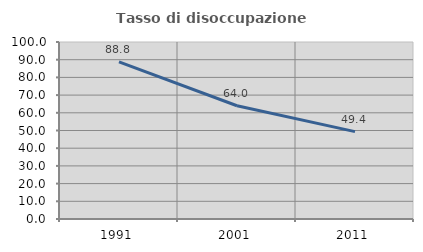
| Category | Tasso di disoccupazione giovanile  |
|---|---|
| 1991.0 | 88.779 |
| 2001.0 | 63.971 |
| 2011.0 | 49.351 |